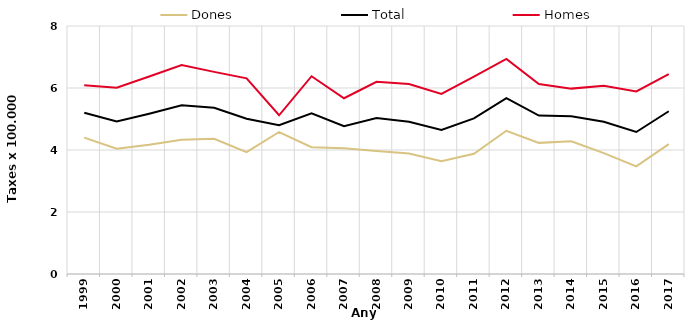
| Category | Dones | Total | Homes |
|---|---|---|---|
| 1999.0 | 4.4 | 5.2 | 6.09 |
| 2000.0 | 4.04 | 4.92 | 6.01 |
| 2001.0 | 4.17 | 5.17 | 6.37 |
| 2002.0 | 4.33 | 5.44 | 6.74 |
| 2003.0 | 4.36 | 5.36 | 6.52 |
| 2004.0 | 3.93 | 5.01 | 6.31 |
| 2005.0 | 4.58 | 4.8 | 5.12 |
| 2006.0 | 4.09 | 5.18 | 6.38 |
| 2007.0 | 4.06 | 4.77 | 5.67 |
| 2008.0 | 3.97 | 5.03 | 6.2 |
| 2009.0 | 3.89 | 4.91 | 6.13 |
| 2010.0 | 3.64 | 4.65 | 5.81 |
| 2011.0 | 3.88 | 5.02 | 6.37 |
| 2012.0 | 4.62 | 5.67 | 6.94 |
| 2013.0 | 4.23 | 5.11 | 6.13 |
| 2014.0 | 4.28 | 5.09 | 5.98 |
| 2015.0 | 3.9 | 4.91 | 6.07 |
| 2016.0 | 3.47 | 4.58 | 5.89 |
| 2017.0 | 4.19 | 5.25 | 6.45 |